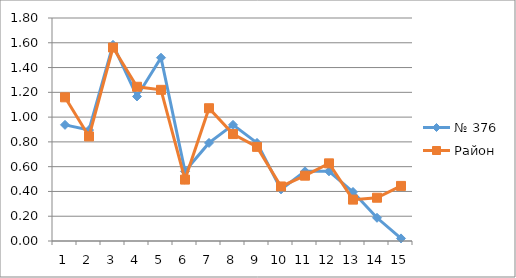
| Category | № 376 | Район |
|---|---|---|
| 0 | 0.938 | 1.16 |
| 1 | 0.896 | 0.844 |
| 2 | 1.583 | 1.562 |
| 3 | 1.167 | 1.245 |
| 4 | 1.479 | 1.22 |
| 5 | 0.562 | 0.496 |
| 6 | 0.792 | 1.072 |
| 7 | 0.938 | 0.863 |
| 8 | 0.792 | 0.76 |
| 9 | 0.417 | 0.44 |
| 10 | 0.562 | 0.527 |
| 11 | 0.562 | 0.627 |
| 12 | 0.396 | 0.334 |
| 13 | 0.188 | 0.349 |
| 14 | 0.021 | 0.445 |